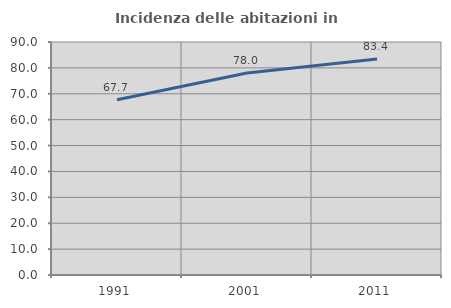
| Category | Incidenza delle abitazioni in proprietà  |
|---|---|
| 1991.0 | 67.677 |
| 2001.0 | 77.995 |
| 2011.0 | 83.444 |